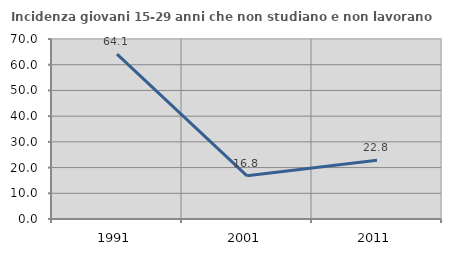
| Category | Incidenza giovani 15-29 anni che non studiano e non lavorano  |
|---|---|
| 1991.0 | 64.149 |
| 2001.0 | 16.775 |
| 2011.0 | 22.81 |